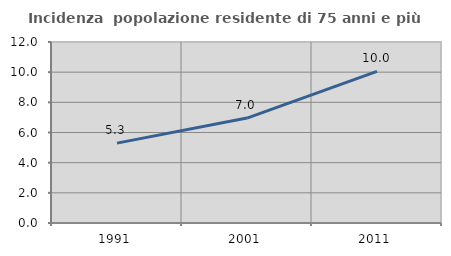
| Category | Incidenza  popolazione residente di 75 anni e più |
|---|---|
| 1991.0 | 5.294 |
| 2001.0 | 6.958 |
| 2011.0 | 10.049 |